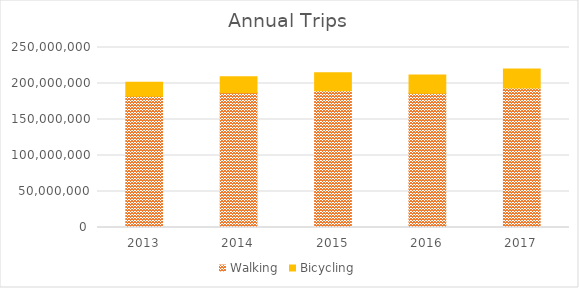
| Category | Walking | Bicycling |
|---|---|---|
| 2013 | 182411716.673 | 19444155.285 |
| 2014 | 187034837.995 | 22213805.083 |
| 2015 | 189845376.212 | 25071677.909 |
| 2016 | 186315481.495 | 25393416.106 |
| 2017 | 193576935.774 | 26450975.911 |